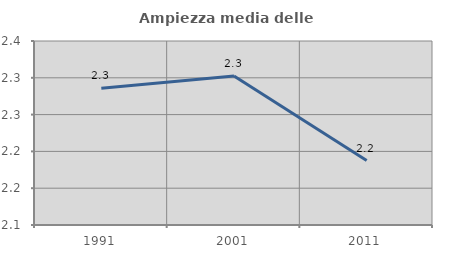
| Category | Ampiezza media delle famiglie |
|---|---|
| 1991.0 | 2.286 |
| 2001.0 | 2.302 |
| 2011.0 | 2.188 |